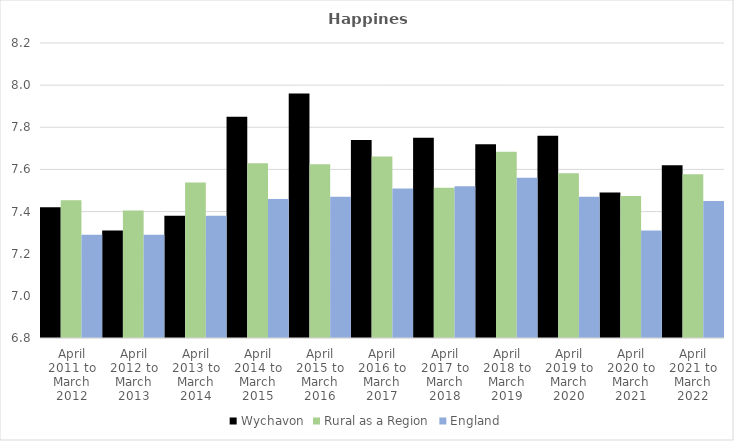
| Category | Wychavon | Rural as a Region | England |
|---|---|---|---|
| April 2011 to March 2012 | 7.42 | 7.454 | 7.29 |
| April 2012 to March 2013 | 7.31 | 7.406 | 7.29 |
| April 2013 to March 2014 | 7.38 | 7.539 | 7.38 |
| April 2014 to March 2015 | 7.85 | 7.63 | 7.46 |
| April 2015 to March 2016 | 7.96 | 7.625 | 7.47 |
| April 2016 to March 2017 | 7.74 | 7.661 | 7.51 |
| April 2017 to March 2018 | 7.75 | 7.513 | 7.52 |
| April 2018 to March 2019 | 7.72 | 7.684 | 7.56 |
| April 2019 to March 2020 | 7.76 | 7.582 | 7.47 |
| April 2020 to March 2021 | 7.49 | 7.474 | 7.31 |
| April 2021 to March 2022 | 7.62 | 7.577 | 7.45 |